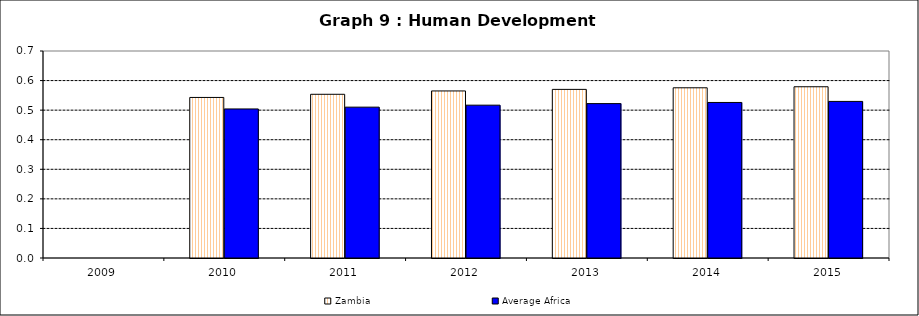
| Category | Zambia | Average Africa |
|---|---|---|
| 2009.0 | 0 | 0 |
| 2010.0 | 0.543 | 0.504 |
| 2011.0 | 0.554 | 0.51 |
| 2012.0 | 0.565 | 0.517 |
| 2013.0 | 0.57 | 0.522 |
| 2014.0 | 0.576 | 0.526 |
| 2015.0 | 0.579 | 0.53 |